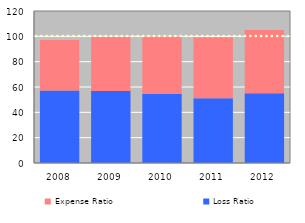
| Category | Loss Ratio | Expense Ratio |
|---|---|---|
| 2008 | 57.27 | 39.84 |
| 2009 | 56.9 | 42.71 |
| 2010 | 54.72 | 45.23 |
| 2011 | 51.18 | 48.09 |
| 2012 | 54.97 | 50.12 |